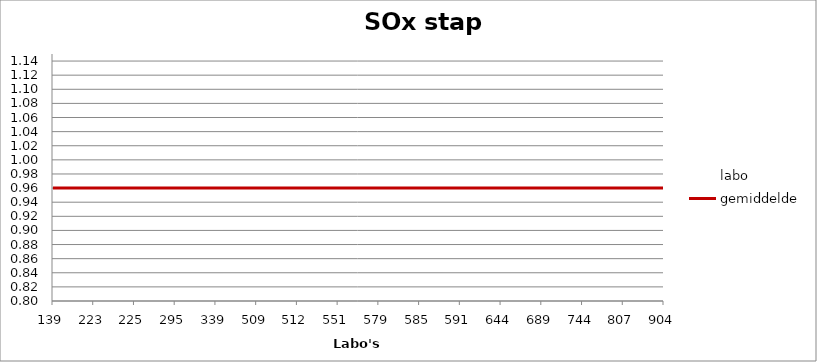
| Category | labo | gemiddelde |
|---|---|---|
| 139.0 | 1.001 | 0.96 |
| 223.0 | 0.976 | 0.96 |
| 225.0 | 0.889 | 0.96 |
| 295.0 | 0.964 | 0.96 |
| 339.0 | 0.973 | 0.96 |
| 509.0 | 0.976 | 0.96 |
| 512.0 | 0.958 | 0.96 |
| 551.0 | 0.947 | 0.96 |
| 579.0 | 0.889 | 0.96 |
| 585.0 | 0.893 | 0.96 |
| 591.0 | 0.976 | 0.96 |
| 644.0 | 1.018 | 0.96 |
| 689.0 | 0.933 | 0.96 |
| 744.0 | 0.998 | 0.96 |
| 807.0 | 1.038 | 0.96 |
| 904.0 | 0.883 | 0.96 |